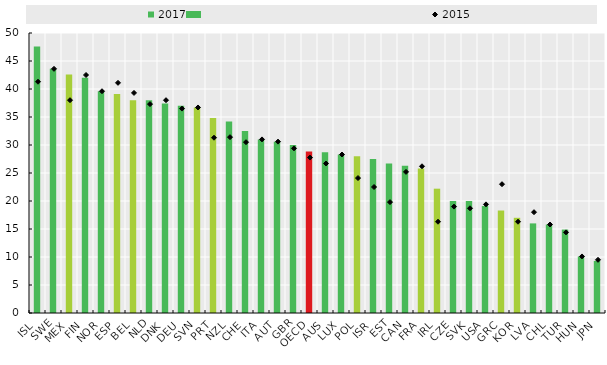
| Category | 2017 |
|---|---|
| ISL | 47.6 |
| SWE | 43.6 |
| MEX | 42.6 |
| FIN | 42 |
| NOR | 39.6 |
| ESP | 39.1 |
| BEL | 38 |
| NLD | 38 |
| DNK | 37.4 |
| DEU | 37 |
| SVN | 36.7 |
| PRT | 34.8 |
| NZL | 34.2 |
| CHE | 32.5 |
| ITA | 31 |
| AUT | 30.6 |
| GBR | 30 |
| OECD | 28.82 |
| AUS | 28.7 |
| LUX | 28.3 |
| POL | 28 |
| ISR | 27.5 |
| EST | 26.7 |
| CAN | 26.3 |
| FRA | 25.8 |
| IRL | 22.2 |
| CZE | 20 |
| SVK | 20 |
| USA | 19.1 |
| GRC | 18.3 |
| KOR | 17 |
| LVA | 16 |
| CHL | 15.8 |
| TUR | 14.9 |
| HUN | 10.1 |
| JPN | 9.3 |